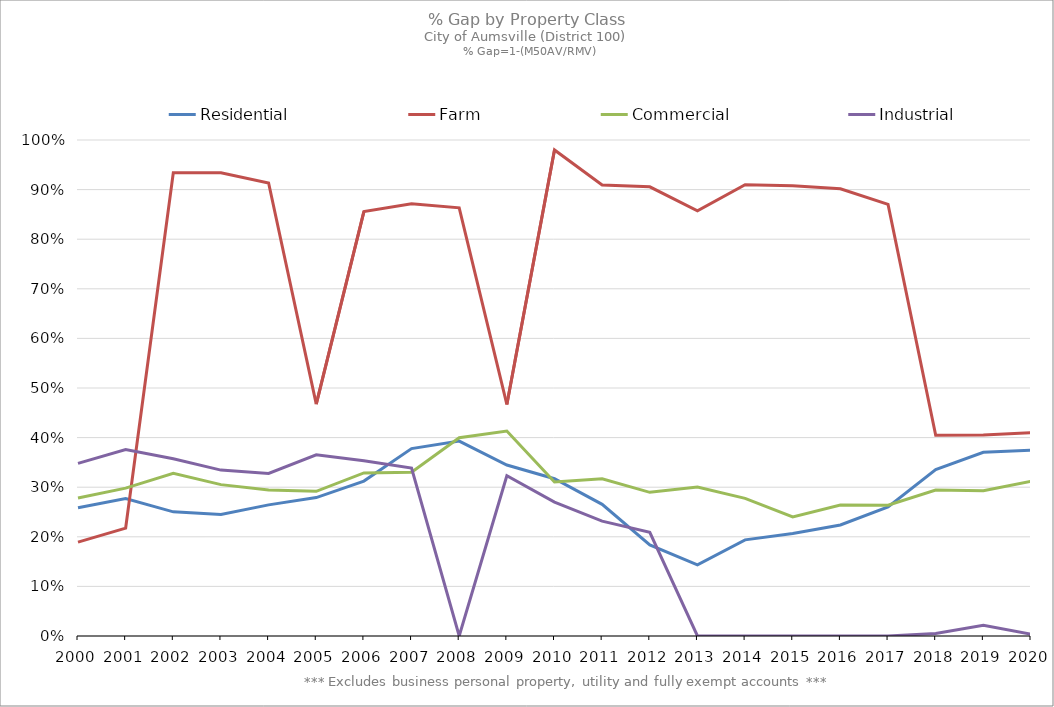
| Category | Residential | Farm | Commercial | Industrial |
|---|---|---|---|---|
| 2000.0 | 0.258 | 0.189 | 0.278 | 0.348 |
| 2001.0 | 0.277 | 0.218 | 0.298 | 0.376 |
| 2002.0 | 0.25 | 0.934 | 0.328 | 0.357 |
| 2003.0 | 0.245 | 0.934 | 0.305 | 0.334 |
| 2004.0 | 0.264 | 0.913 | 0.294 | 0.328 |
| 2005.0 | 0.279 | 0.468 | 0.292 | 0.365 |
| 2006.0 | 0.312 | 0.856 | 0.329 | 0.353 |
| 2007.0 | 0.378 | 0.871 | 0.33 | 0.339 |
| 2008.0 | 0.393 | 0.863 | 0.4 | 0 |
| 2009.0 | 0.345 | 0.467 | 0.413 | 0.323 |
| 2010.0 | 0.317 | 0.98 | 0.311 | 0.27 |
| 2011.0 | 0.265 | 0.909 | 0.317 | 0.232 |
| 2012.0 | 0.184 | 0.906 | 0.29 | 0.209 |
| 2013.0 | 0.143 | 0.857 | 0.3 | 0 |
| 2014.0 | 0.194 | 0.91 | 0.278 | 0 |
| 2015.0 | 0.207 | 0.908 | 0.24 | 0 |
| 2016.0 | 0.224 | 0.902 | 0.264 | 0 |
| 2017.0 | 0.26 | 0.87 | 0.264 | 0 |
| 2018.0 | 0.336 | 0.405 | 0.294 | 0.005 |
| 2019.0 | 0.37 | 0.405 | 0.293 | 0.021 |
| 2020.0 | 0.374 | 0.41 | 0.312 | 0.003 |